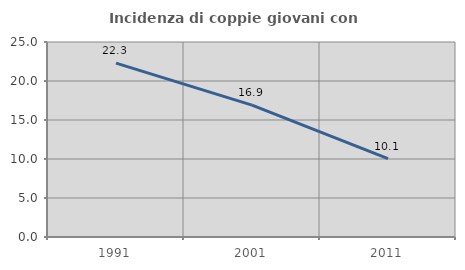
| Category | Incidenza di coppie giovani con figli |
|---|---|
| 1991.0 | 22.287 |
| 2001.0 | 16.903 |
| 2011.0 | 10.061 |